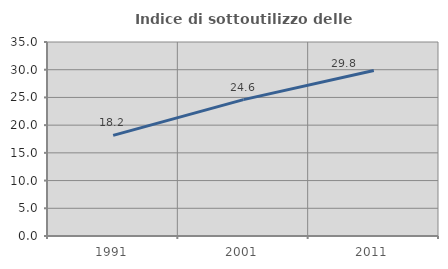
| Category | Indice di sottoutilizzo delle abitazioni  |
|---|---|
| 1991.0 | 18.159 |
| 2001.0 | 24.608 |
| 2011.0 | 29.847 |